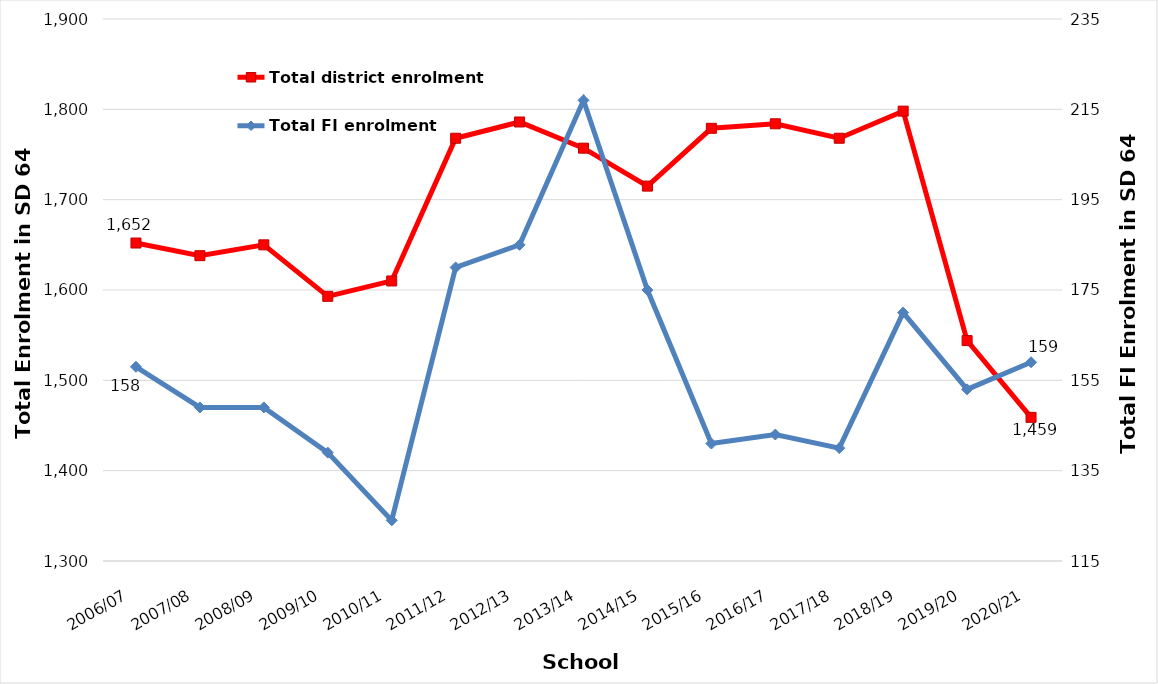
| Category | Total district enrolment  |
|---|---|
| 2006/07 | 1652 |
| 2007/08 | 1638 |
| 2008/09 | 1650 |
| 2009/10 | 1593 |
| 2010/11 | 1610 |
| 2011/12 | 1768 |
| 2012/13 | 1786 |
| 2013/14 | 1757 |
| 2014/15 | 1715 |
| 2015/16 | 1779 |
| 2016/17 | 1784 |
| 2017/18 | 1768 |
| 2018/19 | 1798 |
| 2019/20 | 1544 |
| 2020/21 | 1459 |